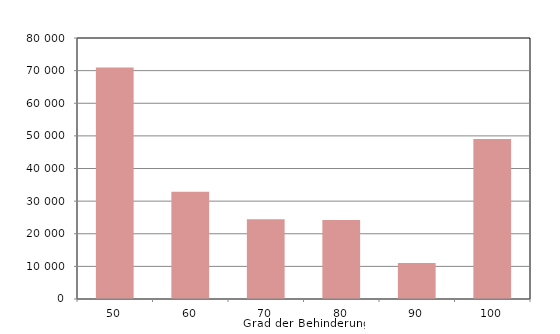
| Category | Series 0 |
|---|---|
| 50.0 | 70958 |
| 60.0 | 32859 |
| 70.0 | 24423 |
| 80.0 | 24210 |
| 90.0 | 11055 |
| 100.0 | 49072 |